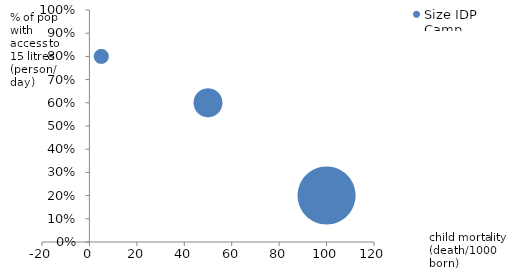
| Category | Size IDP Camp |
|---|---|
| 5.0 | 0.8 |
| 50.0 | 0.6 |
| 100.0 | 0.2 |